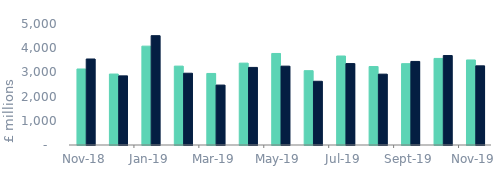
| Category | Full market | Remortgage without equity withdrawn |
|---|---|---|
| 2018-11-01 | 3140.547 | 3554.237 |
| 2018-12-01 | 2932.423 | 2856.967 |
| 2019-01-01 | 4084.713 | 4518.277 |
| 2019-02-01 | 3259.86 | 2965.535 |
| 2019-03-01 | 2956.131 | 2476.234 |
| 2019-04-01 | 3383.054 | 3206.136 |
| 2019-05-01 | 3782.038 | 3258.519 |
| 2019-06-01 | 3071.036 | 2633.408 |
| 2019-07-01 | 3677.617 | 3364.784 |
| 2019-08-01 | 3242.271 | 2927.848 |
| 2019-09-01 | 3361.305 | 3452.42 |
| 2019-10-01 | 3577.14 | 3696.715 |
| 2019-11-01 | 3513.697 | 3271.216 |